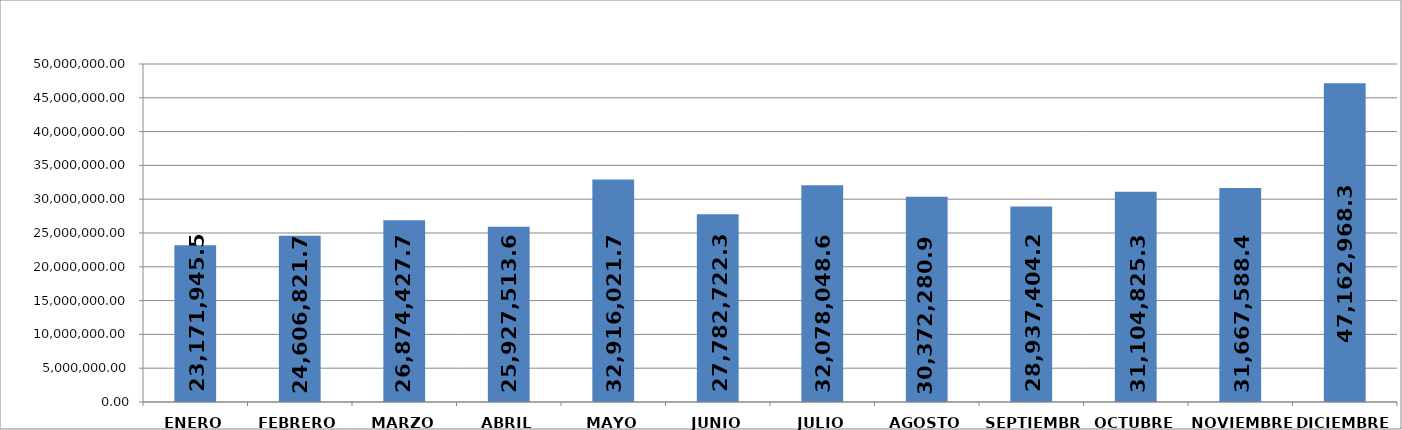
| Category | Series 0 | 23,171,945.50 |
|---|---|---|
| ENERO | 23171945.5 |  |
| FEBRERO | 24606821.73 |  |
| MARZO | 26874427.73 |  |
| ABRIL | 25927513.64 |  |
| MAYO | 32916021.78 |  |
| JUNIO | 27782722.37 |  |
| JULIO | 32078048.65 |  |
| AGOSTO | 30372280.9 |  |
| SEPTIEMBRE | 28937404.29 |  |
| OCTUBRE | 31104825.36 |  |
| NOVIEMBRE | 31667588.42 |  |
| DICIEMBRE | 47162968.3 |  |